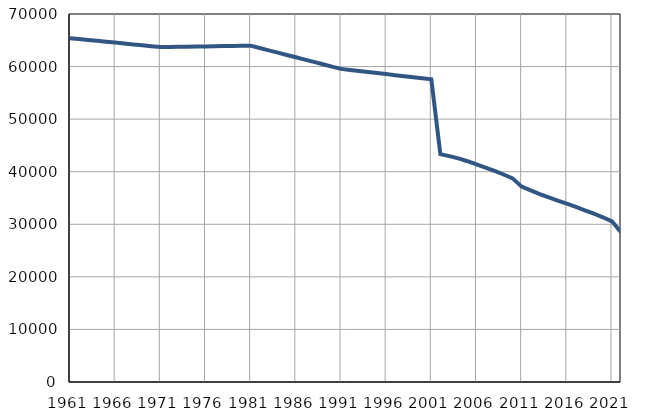
| Category | Population
size |
|---|---|
| 1961.0 | 65409 |
| 1962.0 | 65239 |
| 1963.0 | 65068 |
| 1964.0 | 64898 |
| 1965.0 | 64728 |
| 1966.0 | 64558 |
| 1967.0 | 64386 |
| 1968.0 | 64217 |
| 1969.0 | 64047 |
| 1970.0 | 63876 |
| 1971.0 | 63706 |
| 1972.0 | 63733 |
| 1973.0 | 63759 |
| 1974.0 | 63786 |
| 1975.0 | 63813 |
| 1976.0 | 63840 |
| 1977.0 | 63866 |
| 1978.0 | 63893 |
| 1979.0 | 63920 |
| 1980.0 | 63946 |
| 1981.0 | 63973 |
| 1982.0 | 63532 |
| 1983.0 | 63090 |
| 1984.0 | 62649 |
| 1985.0 | 62207 |
| 1986.0 | 61766 |
| 1987.0 | 61325 |
| 1988.0 | 60883 |
| 1989.0 | 60442 |
| 1990.0 | 60000 |
| 1991.0 | 59559 |
| 1992.0 | 59361 |
| 1993.0 | 59163 |
| 1994.0 | 58964 |
| 1995.0 | 58766 |
| 1996.0 | 58568 |
| 1997.0 | 58370 |
| 1998.0 | 58172 |
| 1999.0 | 57974 |
| 2000.0 | 57775 |
| 2001.0 | 57577 |
| 2002.0 | 43349 |
| 2003.0 | 42958 |
| 2004.0 | 42526 |
| 2005.0 | 41995 |
| 2006.0 | 41380 |
| 2007.0 | 40764 |
| 2008.0 | 40141 |
| 2009.0 | 39470 |
| 2010.0 | 38734 |
| 2011.0 | 37164 |
| 2012.0 | 36452 |
| 2013.0 | 35735 |
| 2014.0 | 35103 |
| 2015.0 | 34497 |
| 2016.0 | 33911 |
| 2017.0 | 33304 |
| 2018.0 | 32654 |
| 2019.0 | 32007 |
| 2020.0 | 31332 |
| 2021.0 | 30561 |
| 2022.0 | 28467 |